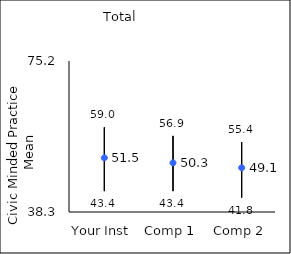
| Category | 25th percentile | 75th percentile | Mean |
|---|---|---|---|
| Your Inst | 43.4 | 59 | 51.54 |
| Comp 1 | 43.4 | 56.9 | 50.33 |
| Comp 2 | 41.8 | 55.4 | 49.11 |